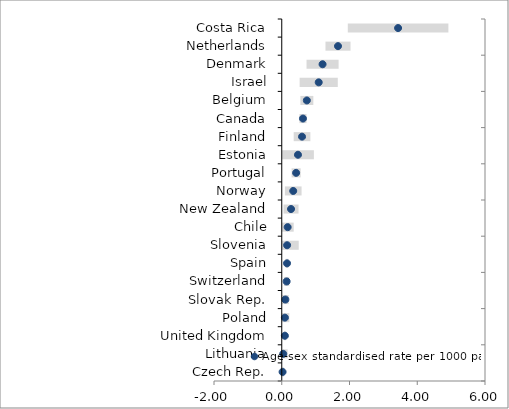
| Category | Low CI | Inter CI |
|---|---|---|
| Czech Rep. | -0.009 | 0.066 |
| Lithuania | -0.043 | 0.174 |
| United Kingdom | 0.065 | 0.054 |
| Poland | -0.019 | 0.223 |
| Slovak Rep. | 0.008 | 0.198 |
| Switzerland | 0.064 | 0.161 |
| Spain | 0.116 | 0.079 |
| Slovenia | -0.093 | 0.502 |
| Chile | -0.003 | 0.353 |
| New Zealand | 0.054 | 0.441 |
| Norway | 0.093 | 0.491 |
| Portugal | 0.291 | 0.267 |
| Estonia | 0.009 | 0.94 |
| Finland | 0.353 | 0.492 |
| Canada | 0.522 | 0.209 |
| Belgium | 0.55 | 0.382 |
| Israel | 0.528 | 1.126 |
| Denmark | 0.731 | 0.947 |
| Netherlands | 1.291 | 0.739 |
| Costa Rica | 1.95 | 2.969 |